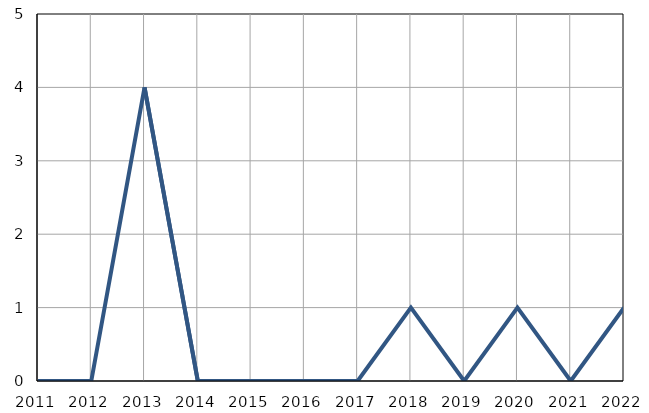
| Category | Infants
deaths |
|---|---|
| 2011.0 | 0 |
| 2012.0 | 0 |
| 2013.0 | 4 |
| 2014.0 | 0 |
| 2015.0 | 0 |
| 2016.0 | 0 |
| 2017.0 | 0 |
| 2018.0 | 1 |
| 2019.0 | 0 |
| 2020.0 | 1 |
| 2021.0 | 0 |
| 2022.0 | 1 |